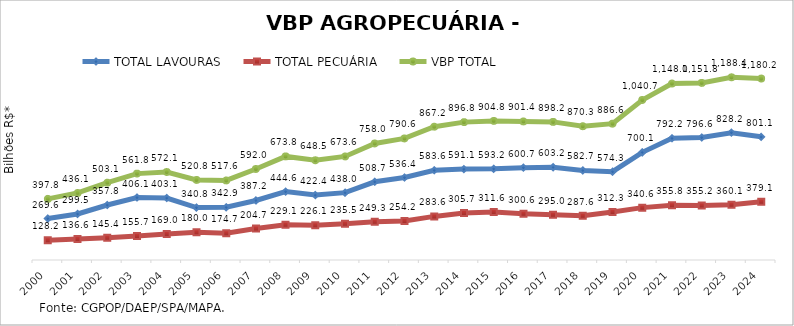
| Category | TOTAL LAVOURAS | TOTAL PECUÁRIA | VBP TOTAL |
|---|---|---|---|
| 2000 | 269.642 | 128.153 | 397.795 |
| 2001 | 299.522 | 136.556 | 436.078 |
| 2002 | 357.789 | 145.355 | 503.144 |
| 2003 | 406.088 | 155.695 | 561.783 |
| 2004 | 403.115 | 169.013 | 572.128 |
| 2005 | 340.815 | 179.967 | 520.782 |
| 2006 | 342.898 | 174.705 | 517.603 |
| 2007 | 387.24 | 204.717 | 591.958 |
| 2008 | 444.647 | 229.141 | 673.788 |
| 2009 | 422.356 | 226.096 | 648.452 |
| 2010 | 438.03 | 235.522 | 673.552 |
| 2011 | 508.718 | 249.259 | 757.977 |
| 2012 | 536.381 | 254.229 | 790.61 |
| 2013 | 583.586 | 283.608 | 867.195 |
| 2014 | 591.095 | 305.696 | 896.791 |
| 2015 | 593.239 | 311.57 | 904.809 |
| 2016 | 600.741 | 300.633 | 901.373 |
| 2017 | 603.235 | 295.001 | 898.236 |
| 2018 | 582.691 | 287.602 | 870.294 |
| 2019 | 574.312 | 312.314 | 886.626 |
| 2020 | 700.1 | 340.626 | 1040.725 |
| 2021 | 792.18 | 355.789 | 1147.968 |
| 2022 | 796.643 | 355.2 | 1151.843 |
| 2023 | 828.228 | 360.142 | 1188.37 |
| 2024 | 801.106 | 379.062 | 1180.168 |